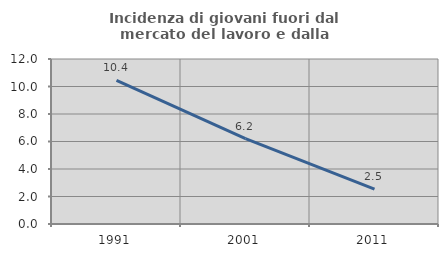
| Category | Incidenza di giovani fuori dal mercato del lavoro e dalla formazione  |
|---|---|
| 1991.0 | 10.448 |
| 2001.0 | 6.215 |
| 2011.0 | 2.532 |